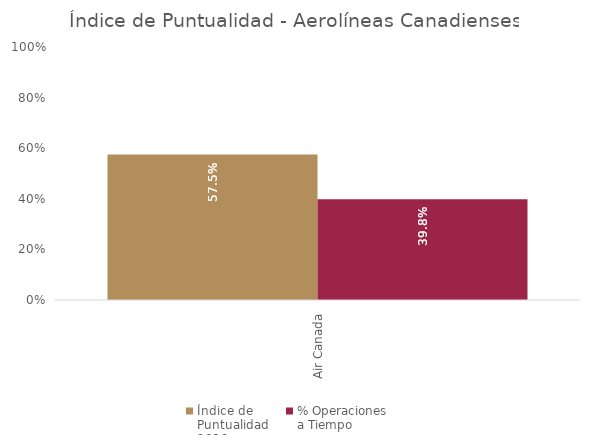
| Category | Índice de 
Puntualidad
2019 | % Operaciones 
a Tiempo |
|---|---|---|
| Air Canada | 0.575 | 0.398 |